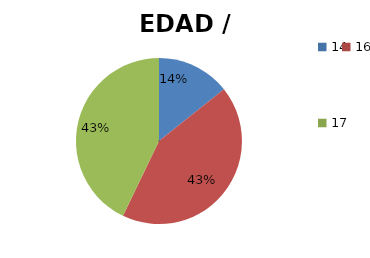
| Category | EDAD / DETENIDOS |
|---|---|
| 14.0 | 4 |
| 16.0 | 3 |
| 17.0 | 6 |